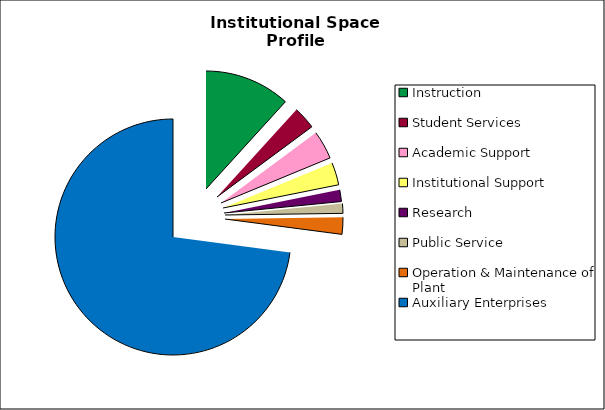
| Category | Series 0 |
|---|---|
| Instruction | 261989 |
| Student Services | 69431 |
| Academic Support | 87066 |
| Institutional Support | 68733 |
| Research | 35831 |
| Public Service | 29593 |
| Operation & Maintenance of Plant | 51386 |
| Auxiliary Enterprises | 1626353 |